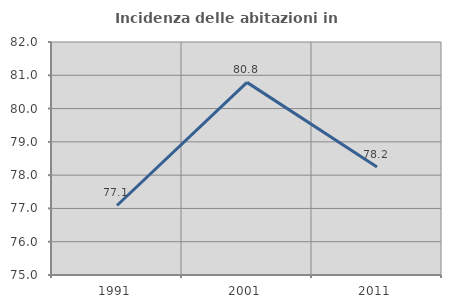
| Category | Incidenza delle abitazioni in proprietà  |
|---|---|
| 1991.0 | 77.089 |
| 2001.0 | 80.787 |
| 2011.0 | 78.243 |